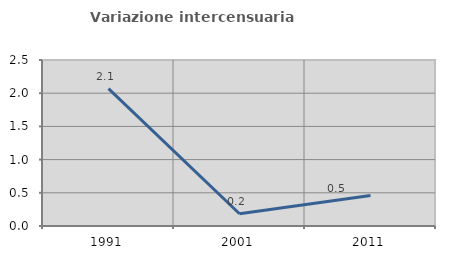
| Category | Variazione intercensuaria annua |
|---|---|
| 1991.0 | 2.07 |
| 2001.0 | 0.184 |
| 2011.0 | 0.46 |